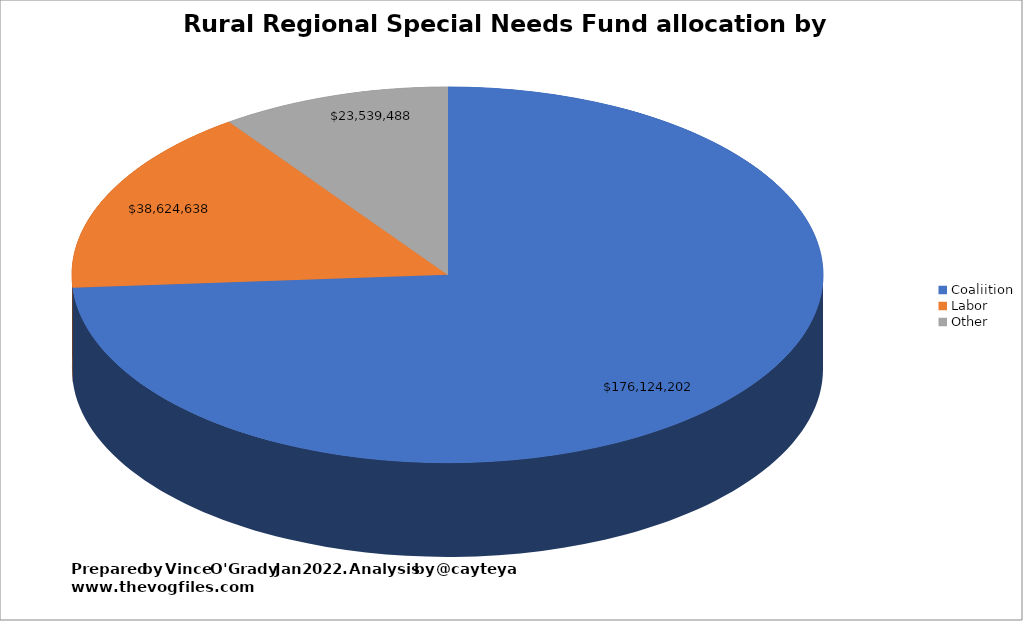
| Category | Values |
|---|---|
| Coaliition | 176124202.2 |
| Labor | 38624638.1 |
| Other | 23539488.2 |